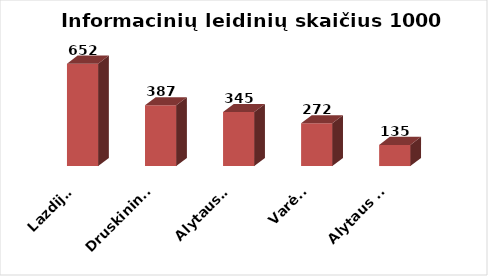
| Category | Series 0 |
|---|---|
| Lazdijai | 652.431 |
| Druskininkai | 386.909 |
| Alytaus r. | 344.598 |
| Varėna | 272.277 |
| Alytaus m. | 134.78 |